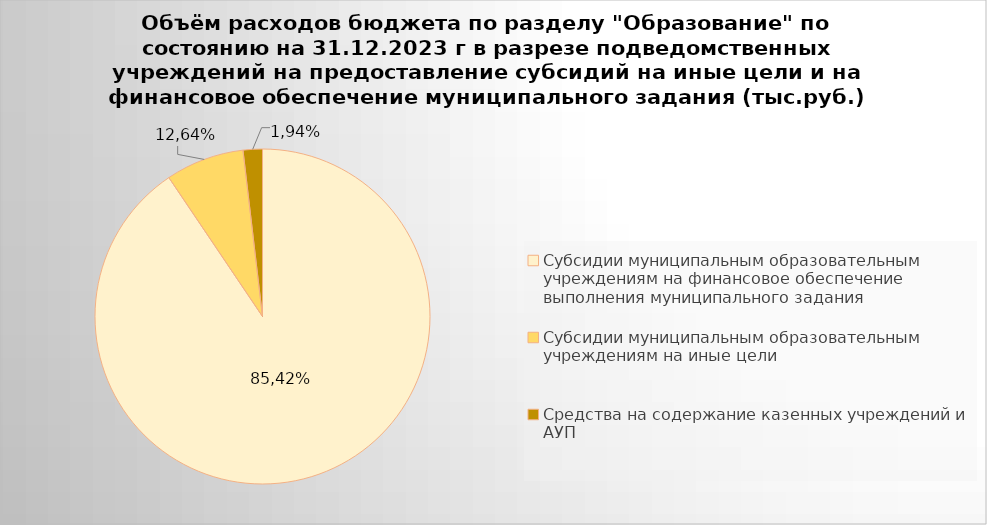
| Category | Series 0 |
|---|---|
| Субсидии муниципальным образовательным учреждениям на финансовое обеспечение выполнения муниципального задания | 8121673.44 |
| Субсидии муниципальным образовательным учреждениям на иные цели | 679814.85 |
| Средства на содержание казенных учреждений и АУП | 166927.01 |